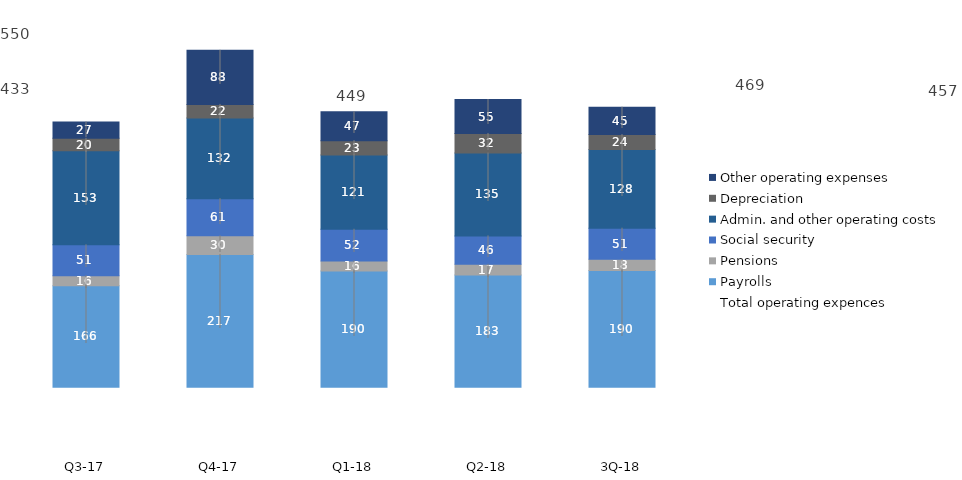
| Category | Payrolls | Pensions | Social security | Admin. and other operating costs | Depreciation | Other operating expenses |
|---|---|---|---|---|---|---|
| 3Q-18 | 190.273 | 18.438 | 50.778 | 128.41 | 24.363 | 44.712 |
| Q2-18 | 183.153 | 17.319 | 46.468 | 135.219 | 31.886 | 55.331 |
| Q1-18 | 189.7 | 16.4 | 51.6 | 121.4 | 23.2 | 47.1 |
| Q4-17 | 216.6 | 30.4 | 60.6 | 131.8 | 22 | 88.4 |
| Q3-17 | 165.7 | 16.2 | 50.5 | 153.4 | 20.4 | 26.6 |